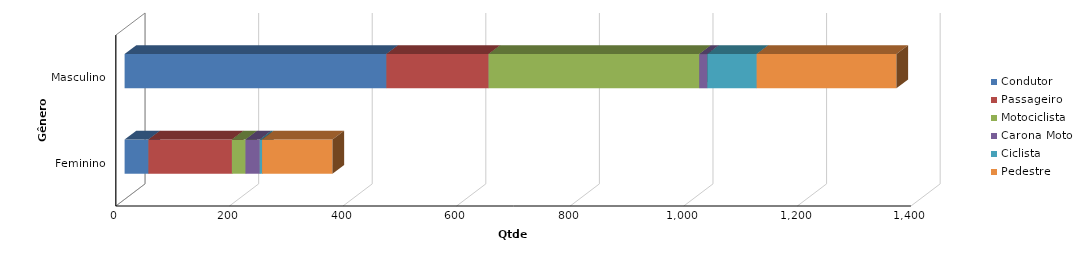
| Category | Condutor | Passageiro | Motociclista | Carona Moto | Ciclista | Pedestre |
|---|---|---|---|---|---|---|
| Feminino | 42 | 147 | 24 | 25 | 4 | 124 |
| Masculino | 461 | 180 | 371 | 14 | 87 | 246 |